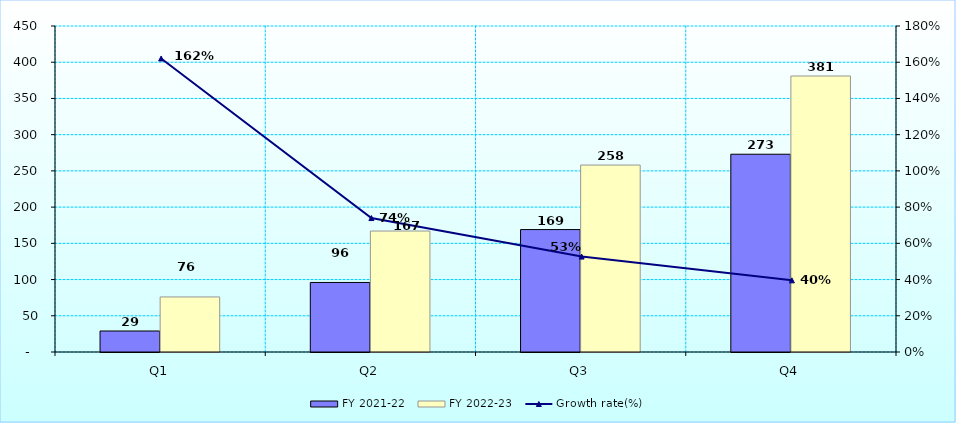
| Category | FY 2021-22 | FY 2022-23 |
|---|---|---|
| Q1 | 29 | 76 |
| Q2 | 96 | 167 |
| Q3 | 169 | 258.046 |
| Q4 | 273 | 381 |